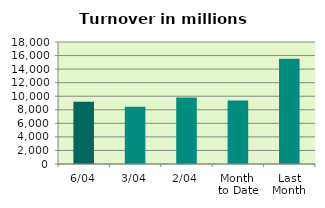
| Category | Series 0 |
|---|---|
| 6/04 | 9176.832 |
| 3/04 | 8443.488 |
| 2/04 | 9801.017 |
| Month 
to Date | 9376.583 |
| Last
Month | 15518.097 |